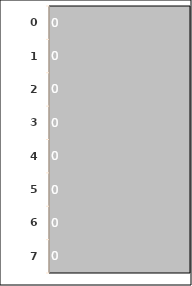
| Category | Series 1 |
|---|---|
| 0.0 | 0 |
| 1.0 | 0 |
| 2.0 | 0 |
| 3.0 | 0 |
| 4.0 | 0 |
| 5.0 | 0 |
| 6.0 | 0 |
| 7.0 | 0 |